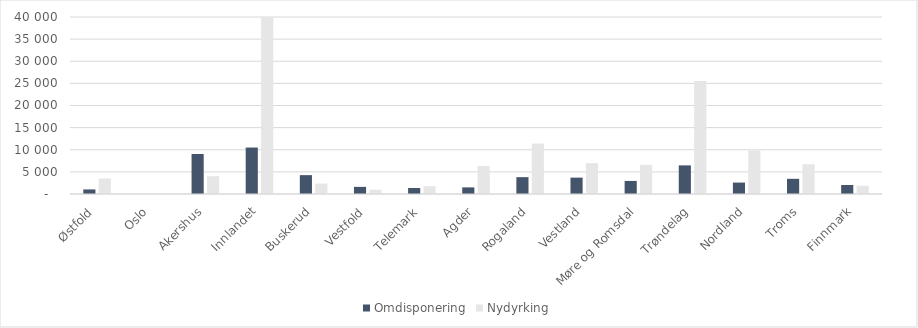
| Category | Omdisponering | Nydyrking |
|---|---|---|
| Østfold | 1033 | 3497 |
| Oslo | 6 | 1 |
| Akershus | 9041 | 4020 |
| Innlandet | 10498 | 39930 |
| Buskerud | 4263 | 2354 |
| Vestfold | 1608 | 958 |
| Telemark | 1351 | 1772 |
| Agder | 1493 | 6340 |
| Rogaland | 3809 | 11399 |
| Vestland | 3697 | 6979 |
| Møre og Romsdal | 2952 | 6593 |
| Trøndelag | 6467 | 25532 |
| Nordland | 2581 | 9819 |
| Troms | 3431 | 6723 |
| Finnmark | 2035 | 1871 |